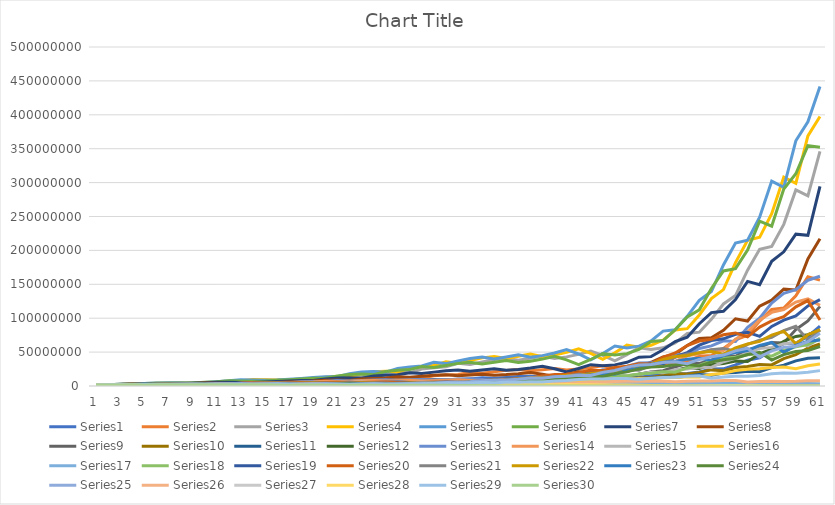
| Category | Series 0 | Series 1 | Series 2 | Series 3 | Series 4 | Series 5 | Series 6 | Series 7 | Series 8 | Series 9 | Series 10 | Series 11 | Series 12 | Series 13 | Series 14 | Series 15 | Series 16 | Series 17 | Series 18 | Series 19 | Series 20 | Series 21 | Series 22 | Series 23 | Series 24 | Series 25 | Series 26 | Series 27 | Series 28 | Series 29 |
|---|---|---|---|---|---|---|---|---|---|---|---|---|---|---|---|---|---|---|---|---|---|---|---|---|---|---|---|---|---|---|
| 0 | 1500000 | 1500000 | 1500000 | 1500000 | 1500000 | 1500000 | 1500000 | 1500000 | 1500000 | 1500000 | 1500000 | 1500000 | 1500000 | 1500000 | 1500000 | 1500000 | 1500000 | 1500000 | 1500000 | 1500000 | 1500000 | 1500000 | 1500000 | 1500000 | 1500000 | 1500000 | 1500000 | 1500000 | 1500000 | 1500000 |
| 1 | 1134576 | 1059408 | 1413792 | 1538352 | 1732752 | 1948752 | 1891152 | 1949904 | 1715184 | 1588464 | 1442304 | 1383696 | 1679328 | 1798272 | 1718928 | 1773072 | 1405296 | 1390032 | 1495440 | 1677600 | 1622736 | 1617408 | 1598256 | 1466928 | 1884384 | 1663776 | 1503792 | 1378080 | 1849968 | 1567584 |
| 2 | 794508.387 | 987287.105 | 1449584.234 | 1776388.918 | 2261662.356 | 2479684.665 | 2476535.729 | 2252513.849 | 1826694.554 | 1530477.456 | 1325306.334 | 1536051.606 | 2017744.064 | 2073802.851 | 2040958.206 | 1666823.842 | 1290280.17 | 1376446.944 | 1672966.006 | 1822139.791 | 1749967.989 | 1727049.266 | 1566522.589 | 1840861.535 | 2108086.916 | 1673867.708 | 1379790.25 | 1691233.685 | 1947899.026 | 1584606.081 |
| 3 | 731928.376 | 1000209.173 | 1673453.928 | 2317818.884 | 2888597.417 | 3272597.959 | 2877176.102 | 2420747.775 | 1769876.652 | 1409596.472 | 1463986.809 | 1830147.983 | 2331441.271 | 2476678.746 | 1926809.735 | 1537117.374 | 1263199.189 | 1529016.345 | 1817581.082 | 1973149.612 | 1868823.93 | 1696319.77 | 1970548.273 | 2057585.835 | 2138039.289 | 1541647.755 | 1690784.846 | 1773300.256 | 1983936.333 | 1812007.674 |
| 4 | 732278.317 | 1140017.458 | 2182991.184 | 2959507.087 | 3824133.077 | 3824616.197 | 3107428.082 | 2366091.785 | 1640429.284 | 1561699.374 | 1735647.634 | 2099082.258 | 2789324.759 | 2350966.008 | 1786447.627 | 1513033.61 | 1386356.218 | 1650159.668 | 1968742.399 | 2115736.072 | 1835791.76 | 2138591.033 | 2206859.983 | 2085103.514 | 1986028.237 | 1897475.205 | 1770546.885 | 1798545.884 | 2286351.073 | 1659281.783 |
| 5 | 823291.224 | 1469507.211 | 2786824.661 | 3917113.781 | 4479676.461 | 4151864.04 | 3051690.005 | 2214554.063 | 1831965.663 | 1857005.448 | 1981899.664 | 2494332.524 | 2652135.977 | 2194682.47 | 1770069.844 | 1670185.637 | 1478907.695 | 1775099.474 | 2111565.254 | 2086583.548 | 2314720.646 | 2399423.1 | 2240471.214 | 1935181.665 | 2468602.876 | 1994481.839 | 1793430.266 | 2063774.169 | 2108504.869 | 1786518.257 |
| 6 | 1047426.927 | 1858057.316 | 3687976.111 | 4587807.597 | 4872748.766 | 4097170.425 | 2871146.199 | 2503154.594 | 2195727.108 | 2126117.803 | 2345427.511 | 2356611.036 | 2480942.408 | 2192627.745 | 1967529.616 | 1791687.9 | 1571473.734 | 1890986.01 | 2083001.658 | 2641956.31 | 2597302.884 | 2440102.648 | 2083376.771 | 2403022.354 | 2616410.052 | 2027895.648 | 2055150.047 | 1895807.469 | 2288575.698 | 1909586.415 |
| 7 | 1310156.705 | 2439156.728 | 4318924.885 | 4989635.022 | 4817642.689 | 3875116.406 | 3265911.755 | 3035774.071 | 2531628.424 | 2522321.084 | 2207324.202 | 2187025.472 | 2484742.186 | 2458260.961 | 2124708.304 | 1915190.834 | 1653585.835 | 1853064.931 | 2638128.43 | 2974554.118 | 2641591.104 | 2273039.288 | 2592730.407 | 2544798.327 | 2682172.245 | 2332896.437 | 1885581.886 | 2048579.887 | 2465401.835 | 1945085.645 |
| 8 | 1704107.847 | 2839060.946 | 4696726.24 | 4932527.346 | 4565839.1 | 4435891.098 | 3984945.686 | 3536205.57 | 3022869.654 | 2379368.097 | 2038426.47 | 2169491.742 | 2792834.698 | 2676199.24 | 2287028.464 | 2027398.661 | 1600680.451 | 2330490.552 | 2970888.037 | 3034786.65 | 2460979.549 | 2834480.165 | 2750734.027 | 2606641.798 | 3111511.904 | 2148003.17 | 2034689.17 | 2197415.557 | 2530446.295 | 1754121.993 |
| 9 | 1969458.961 | 3071239.672 | 4642529.715 | 4674024.664 | 5239286.091 | 5445050.545 | 4665967.861 | 4261718.214 | 2868922.417 | 2203836.785 | 2009966.954 | 2414439.034 | 3047618.262 | 2904835.21 | 2437866.741 | 1974378.239 | 1986632.268 | 2609506.562 | 3031652.486 | 2836540.45 | 3069191.422 | 3012268.28 | 2822655.389 | 3021405.921 | 2886543.778 | 2327237.305 | 2179563.852 | 2245996.44 | 2300159.703 | 1822993.428 |
| 10 | 2117388.207 | 3020799.477 | 4398774.294 | 5362480.862 | 6445917.945 | 6407957.174 | 5649351.298 | 4079559.202 | 2677613.079 | 2180976.682 | 2222810.609 | 2610322.444 | 3315979.689 | 3121925.187 | 2390454.44 | 2466497.417 | 2200249.025 | 2648814.161 | 2834198.597 | 3550671.606 | 3262009.812 | 3096108.81 | 3277746.752 | 2800896.7 | 3154026.5 | 2502696.11 | 2224802.517 | 2032791.955 | 2412837.232 | 1889933.831 |
| 11 | 2070366.16 | 2846864.509 | 5046072.256 | 6596391.967 | 7600349.012 | 7793273.344 | 5430789.992 | 3848101.439 | 2674394.648 | 2421182.771 | 2388722.734 | 2813110.502 | 3572156.63 | 3085782.384 | 3008310.427 | 2746623.903 | 2210448.325 | 2462663.26 | 3548569.82 | 3785290.733 | 3353111.053 | 3601242.503 | 3043459.957 | 3057931.831 | 3419407.147 | 2564394.853 | 2010835.52 | 2121604.982 | 2525653.441 | 1672358.129 |
| 12 | 1938579.205 | 3244865.379 | 6206467.558 | 7776694.249 | 9258993.05 | 7522192.878 | 5149094.992 | 3892102.505 | 2997571.421 | 2611433.122 | 2558131.709 | 3002198.633 | 3538790.722 | 3916254.851 | 3370288.835 | 2773630.33 | 2032750.533 | 3064143.712 | 3783778.871 | 3902604.195 | 3900537.205 | 3348753.373 | 3328781.627 | 3312647.005 | 3531182.925 | 2326960.426 | 2095281.842 | 2209254.904 | 2257597.519 | 1694360.301 |
| 13 | 2192335.38 | 3966913.663 | 7316299.883 | 9472671.334 | 8950463.106 | 7166963.725 | 5239303.688 | 4418595.884 | 3262487.639 | 2807382.127 | 2713054.748 | 2947233.995 | 4501790.849 | 4417600.599 | 3422771.031 | 2564710.303 | 2497497.255 | 3250343.019 | 3901774.936 | 4553307.198 | 3627362.901 | 3668700.505 | 3612255.055 | 3418383.899 | 3230033.549 | 2435988.02 | 2178170.749 | 1964054.463 | 2316195.64 | 1754073.712 |
| 14 | 2660131.01 | 4652458.789 | 8911124.125 | 9156020.762 | 8543267.888 | 7333745.289 | 5983774.194 | 4866181.731 | 3540282.958 | 2988790.304 | 2646998.946 | 3713582.012 | 5087727.304 | 4514893.759 | 3183899.399 | 3171245.084 | 2621219.847 | 3334791.503 | 4553190.434 | 4245608.693 | 3974293.174 | 3987284.134 | 3733682.89 | 3124479.648 | 3412977.755 | 2544563.311 | 1932991.1 | 2001521.803 | 2430210.875 | 1851315.054 |
| 15 | 3099952.258 | 5641173.821 | 8612594.826 | 8738331.118 | 8760250.731 | 8422559.892 | 6625765.841 | 5344069.55 | 3803890.816 | 2927051.046 | 3313369.929 | 4164618.321 | 5208832.81 | 4227559.866 | 3963906.024 | 3346392.772 | 2661113.942 | 3871825.775 | 4246199.591 | 4665306.67 | 4319787.148 | 4127402.284 | 3418382.864 | 3298559.638 | 3599067.881 | 2269556.993 | 1965522.102 | 2085092.374 | 2600794.171 | 1551726.48 |
| 16 | 3737379.098 | 5430079.906 | 8218953.227 | 8958929.321 | 10081343.223 | 9372822.188 | 7315902.692 | 5808457.832 | 3758924.305 | 3678764.072 | 3695764.337 | 4233440.06 | 4886096.458 | 5302626.676 | 4206877.228 | 3415673.164 | 3056598.805 | 3594556.548 | 4666806.339 | 5084845.534 | 4471957.674 | 3784516.008 | 3615785.338 | 3475338.158 | 3241705.496 | 2322237.66 | 2042749.382 | 2215113.592 | 2211727.828 | 1193107.675 |
| 17 | 3578878.388 | 5156635.683 | 8425569.64 | 10308477.208 | 11239078.36 | 10400094.21 | 7992415.3 | 5803330.997 | 4769325.417 | 4116988.04 | 3737898.121 | 3941858.945 | 6140976.81 | 5662436.816 | 4318286.092 | 3945031.072 | 2810383.176 | 3930909.884 | 5087348.858 | 5277736.531 | 4100789.101 | 4009936.466 | 3816969.789 | 3127428.581 | 3356862.245 | 2429657.235 | 2164804.653 | 1869451.932 | 1735246.886 | 1354867.961 |
| 18 | 3377264.999 | 5256665.143 | 9693794.556 | 11490805.162 | 12493019.19 | 11414243.383 | 8023890.375 | 7447669.677 | 5378758.887 | 4176907.821 | 3462021.078 | 4913039.427 | 6568498.29 | 5847361.497 | 5016173.049 | 3645408.427 | 3040007.836 | 4265009.642 | 5281188.614 | 4852485.976 | 4345462.422 | 4240364.879 | 3441691.951 | 3234984.209 | 3556432.447 | 2592671.37 | 1822300.582 | 1451354.689 | 2032116.368 | 1526866.757 |
| 19 | 3417586.932 | 6014587.878 | 10804652.276 | 12771210.708 | 13733892.108 | 11508488.846 | 10348032.564 | 8475988.87 | 5496168.364 | 3881325.458 | 4288863.139 | 5219033.436 | 6793829.959 | 6833328.537 | 4658997.139 | 3965636.526 | 3264148.336 | 4407738.677 | 4856451.291 | 5157521.744 | 4595611.698 | 3830193.618 | 3568604.756 | 3423424.919 | 3843569.695 | 2198232.901 | 1409668.076 | 1672917.498 | 2360859.969 | 1340702.813 |
| 20 | 3881835.932 | 6670842.24 | 12007547.147 | 14038060.268 | 13868471.891 | 14906408.897 | 11822259.847 | 8733056.64 | 5145366.643 | 4826401.748 | 4532940.073 | 5362117.794 | 7951983.158 | 6380604.075 | 5097445.95 | 4281248.422 | 3339582.573 | 4034919.278 | 5162693.111 | 5470889.553 | 4151481.879 | 3979842.683 | 3785864.481 | 3695621.742 | 3301394.998 | 1717582.083 | 1615926.156 | 1913768.794 | 2136961.505 | 1270613.973 |
| 21 | 4277001.175 | 7377662.015 | 13197568.464 | 14174074.659 | 17990761.425 | 17087626.216 | 12223155.191 | 8245389.886 | 6452396.248 | 5117127.373 | 4634069.399 | 6234406.484 | 7435488.211 | 7022354.748 | 5533252.033 | 4403355.755 | 3025645.546 | 4267200.163 | 5477388.027 | 4957310.849 | 4314188.299 | 4231349.423 | 4097044.393 | 3170676.933 | 2625407.462 | 1999105.21 | 1838453.943 | 1706164.482 | 2107804.376 | 1273046.209 |
| 22 | 4699174.187 | 8072210.366 | 13324433.938 | 18385192.455 | 20647834.584 | 17720509.457 | 11581235.708 | 10438197.133 | 6888965.978 | 5247501.314 | 5360833.962 | 5795200.436 | 8195888.405 | 7665093.806 | 5720949.156 | 4011204.347 | 3161616.494 | 4503858.576 | 4964127.468 | 5170472.842 | 4587375.217 | 4589097.455 | 3523895.16 | 2517583.486 | 3135942.707 | 2308780.512 | 1630012.261 | 1650190.523 | 2221877.983 | 1352576.609 |
| 23 | 5109740.933 | 8115585.98 | 17281816.346 | 21098734.602 | 21435266.909 | 16841003.069 | 14717995.866 | 11230648.648 | 7112689.684 | 6089538.751 | 4960811.66 | 6346325.849 | 8958841.165 | 7966908.234 | 5239406.246 | 4218195.005 | 3296307.615 | 4060336.944 | 5178736.112 | 5518505.212 | 4975818.372 | 3955721.879 | 2807434.049 | 3000499.967 | 3711622.677 | 2077787.717 | 1565083.611 | 1697627.531 | 2513553.148 | 1199221.245 |
| 24 | 5107327.088 | 10481437.429 | 19831345.846 | 21901713.702 | 20393025.638 | 21473563.197 | 15884705.391 | 11681522.895 | 8310549.274 | 5650959.005 | 5405332.795 | 6894805.871 | 9324160.704 | 7335214.988 | 5543882.256 | 4426680.629 | 2934261.638 | 4209175.53 | 5528580.581 | 6008024.045 | 4289581.463 | 3160608.36 | 3362102.545 | 3544052.107 | 3419548.155 | 2034368.047 | 1595116.129 | 1865195.028 | 2391919.726 | 1246239.152 |
| 25 | 6557211.425 | 11988204.58 | 20585017.781 | 20835221.701 | 26032708.974 | 23237398.754 | 16571359.925 | 13749160.607 | 7758753.285 | 6176690.166 | 5844547.739 | 7134511.956 | 8596480.4 | 7808694.536 | 5854383.539 | 3967315.906 | 2995055.851 | 4464462.541 | 6020341.885 | 5198618.218 | 3427904.683 | 3800736.073 | 3988840.841 | 3258913.983 | 3447940.192 | 2125167.912 | 1732327.02 | 1719450.282 | 2729244.769 | 1286648.622 |
| 26 | 7465055.368 | 12407287.305 | 19581619.609 | 26595015.14 | 28196943.373 | 24302798.379 | 19561072.363 | 12918665.192 | 8537657.233 | 6698538.569 | 6020194.179 | 6539404.909 | 9165413.054 | 8296246.817 | 5280665.837 | 4083461.012 | 3125479.342 | 4830370.621 | 5210436.356 | 4174671.862 | 4123098.359 | 4526323.088 | 3683160.825 | 3278282.299 | 3730653.517 | 2378664.138 | 1576051.585 | 1884864.143 | 3116638.305 | 1187615.702 |
| 27 | 7693766.105 | 11767712.132 | 24993443.202 | 28804119.971 | 29515280.141 | 28757576.429 | 18425642.482 | 14315590.013 | 9317600.245 | 6919619.005 | 5492424.466 | 6926003.548 | 9752514.674 | 7529443.467 | 5477732.875 | 4299046.527 | 3326284.342 | 4153726.184 | 4185386.838 | 5056079.136 | 4911235 | 4194116.186 | 3723842.276 | 3537450.666 | 4347300.701 | 2237983.045 | 1697683.04 | 2066253.532 | 3211021.948 | 1241868.665 |
| 28 | 7266345.929 | 14971714.041 | 27068292.711 | 30148995.939 | 34954897.131 | 27145406.122 | 20473671.614 | 15725407.3 | 9683022.238 | 6331463.806 | 5786068.118 | 7320907.699 | 8864688.997 | 7868125.846 | 5813786.652 | 4616732.355 | 2812433.984 | 3308246.659 | 5071139.873 | 6060261.034 | 4551640.028 | 4258441.57 | 4041832.091 | 4109769.861 | 4264295.718 | 2518072.868 | 1826169.917 | 2041720.673 | 3839676.569 | 1203251.538 |
| 29 | 9201873.534 | 16173015.922 | 28330918.925 | 35703281.581 | 33019123.881 | 30231300.28 | 22546296.824 | 16442282.444 | 8913907.39 | 6692461.949 | 6082978.822 | 6609910.731 | 9280278.807 | 8413985.016 | 6294423.041 | 3940020.877 | 2189077.673 | 3960207.75 | 6080557.016 | 5648771.003 | 4622503.698 | 4644571.664 | 4726192.727 | 4019225.56 | 5042597.635 | 2835782.711 | 1767740.632 | 2328928.67 | 4276356.347 | 991476.788 |
| 30 | 9903149.865 | 16886449.066 | 33548881.762 | 33724342.194 | 36801339.936 | 33361092.644 | 23629064.659 | 15228997.731 | 9487657.935 | 7059912.499 | 5461863.375 | 6864619.857 | 9942414.12 | 9177791.891 | 5416272.257 | 3106172.659 | 2533179.206 | 4696639.17 | 5669595.497 | 5776143.522 | 5042957.21 | 5459827.608 | 4651813.163 | 4736526.568 | 5956108.355 | 2881510.957 | 1966914.819 | 2480266.995 | 4132230.74 | 868576.425 |
| 31 | 10303391.716 | 19949508.599 | 31688234.911 | 37585273.731 | 40640144.459 | 35030701.607 | 21936022.169 | 16321174.857 | 10078315.117 | 6361261.911 | 5634485.95 | 7294555.343 | 10864591.202 | 7956352.872 | 4317608.61 | 3663643.912 | 2909107.809 | 4335171.781 | 5799756.288 | 6350570.801 | 5929816.168 | 5401904.136 | 5522215.78 | 5577040.082 | 6336431.279 | 3393789.928 | 2042380.451 | 2288596.174 | 4512449.368 | 745910.785 |
| 32 | 12130177.043 | 18804946.544 | 35314718.939 | 41503771.923 | 42702026.111 | 32582657.094 | 23569884.578 | 17455604.003 | 9145221.243 | 6590173.83 | 5945995.018 | 7907110.567 | 9435502.993 | 6405068.035 | 5175011.039 | 4285355.677 | 2603522.125 | 4381156.792 | 6379396.178 | 7529956.299 | 5868524.21 | 6450263.127 | 6545664.82 | 5916002.636 | 7835264.427 | 3727432.111 | 1832431.495 | 2364013.965 | 5173724.351 | 463571.273 |
| 33 | 11399983.148 | 20911272.282 | 38995144.062 | 43607452.642 | 39743524.035 | 35083673.505 | 25271852.71 | 15947787.681 | 9554625.066 | 6985190.282 | 6400668.263 | 6812185.038 | 7613570.479 | 7784331.444 | 6144454.838 | 3904388.661 | 2530813.885 | 4752905.206 | 7567761.176 | 7512537.443 | 7009602.374 | 7686113.361 | 6986166.549 | 7293925.628 | 8986950.251 | 3551990.337 | 1824561.345 | 2552673.327 | 4764321.558 | 226582.903 |
| 34 | 12635715.63 | 23044501.368 | 40970358.223 | 40584373.457 | 42824840.497 | 37694705.981 | 23146768.925 | 16796122.478 | 10215359.182 | 7552641.788 | 5475794.099 | 5439090.372 | 9283194.329 | 9359392.933 | 5677664.734 | 3882983.575 | 2620159.05 | 5554623.269 | 7553727.068 | 9053969.551 | 8354928.679 | 8242719.555 | 8666878.2 | 8345102.24 | 8932152.94 | 3816519.059 | 1885940.366 | 2209716.507 | 5540957.366 | 0 |
| 35 | 13883162.722 | 24167053.101 | 38128892.908 | 43728675.155 | 46044010.285 | 34595402.729 | 24449417.809 | 18103708.1 | 11140411.135 | 6490283.584 | 4331185.089 | 6534149.953 | 11193863.186 | 8748552.843 | 5745388.229 | 4133940.146 | 2901237.516 | 5464253.391 | 9108210.945 | 10877823.851 | 8962205.313 | 10274804.316 | 9968304.09 | 8274862.264 | 10064285.346 | 4303086.69 | 1552655.679 | 2372632.713 | 5665485.171 | 0 |
| 36 | 14519044.906 | 22450020.518 | 41081518.64 | 47013483.332 | 42287183.081 | 36628919.214 | 26429763.639 | 19899696.877 | 9655816.964 | 5164556.332 | 5133230.52 | 7774474.601 | 10490680.878 | 8975811.687 | 6242265.99 | 4730507.42 | 2697736.709 | 6482706.546 | 10947860.222 | 11751939.411 | 11174441.345 | 11865403.905 | 9932947.186 | 9300149.859 | 11901314.072 | 3897605.62 | 1548158.204 | 2237319.063 | 6090505.396 | 0 |
| 37 | 13450427.639 | 24139597.706 | 44165978.308 | 43175472.301 | 44808363.197 | 39688835.757 | 29133572.132 | 17382259.227 | 7771117.403 | 6174370.008 | 6031665.922 | 7197808.552 | 10796403.991 | 9905488.098 | 7307233.331 | 4555674.933 | 2990529.193 | 7679905.867 | 11832282.403 | 14756346.603 | 12906996.614 | 11867314.671 | 11222840.456 | 10971076.574 | 11283117.685 | 4442020.171 | 1336655.168 | 2189546.066 | 5753994.111 | 0 |
| 38 | 14418352.451 | 25900957.8 | 40559071.514 | 45747059.126 | 48589694.073 | 43847743.426 | 25517682.414 | 14131163.951 | 9441044.159 | 7313853.672 | 5519253.757 | 7300784.612 | 11955537.134 | 11791971.012 | 7200031.236 | 5273271.73 | 3317025.795 | 8192588.337 | 14862993.008 | 17144461.834 | 12911541.829 | 13461761.792 | 13306310.793 | 10378136.394 | 13575259.943 | 4454902.559 | 1155408.495 | 1863780.025 | 7227087.092 | 0 |
| 39 | 15423988.938 | 23739521.35 | 42973159.629 | 49604869.141 | 53721626.301 | 38489418.854 | 20817871.508 | 17408367.011 | 11347562.989 | 6743496.962 | 5518608.589 | 7953548.588 | 14284017.739 | 11809602.524 | 8557703.613 | 6105739.457 | 3318407.111 | 10158362.627 | 17273905.344 | 17242477.482 | 14649267.74 | 16021074.422 | 12645427.564 | 12455078.986 | 14313356.206 | 4689722.808 | 824182.731 | 2044721.437 | 8018244.924 | 0 |
| 40 | 14094813.856 | 25095875.067 | 46595267.375 | 54841129.381 | 47190852.395 | 31487907.336 | 25768316.684 | 21182113.767 | 10603782.453 | 6805865.754 | 5912888.325 | 9337849.122 | 14354557.753 | 14292214.108 | 10154979.279 | 6375546.53 | 3840110.596 | 11678718.551 | 17377714.794 | 19674202.73 | 17437694.834 | 15277365.311 | 15255503.96 | 13103291.281 | 15882065.875 | 4336213.872 | 648432.849 | 1986513.274 | 9469623.111 | 0 |
| 41 | 14848463.499 | 27150455.21 | 51511952.445 | 48171811.754 | 38642049.413 | 39122058.782 | 31484036.289 | 20012583.676 | 10875374.421 | 7371902.496 | 6815349.757 | 9227410.108 | 17437084.641 | 17234242.279 | 10849334.815 | 7733425.043 | 4147720.357 | 11632655.641 | 19834585.2 | 23543937.989 | 16631107.934 | 18501220.74 | 16123019.597 | 14507259.276 | 15474637.725 | 5309806.568 | 351158.79 | 2025496.25 | 10231872.365 | 0 |
| 42 | 16008609.477 | 29951184.105 | 45245906.519 | 39442756.905 | 48070095.372 | 47954077.199 | 29854274.348 | 20790655.806 | 11997047.418 | 8600698.467 | 6612254.186 | 11002997.693 | 21094890.601 | 18679658.288 | 13473101.414 | 8723587.331 | 3885007.134 | 13137646.899 | 23742650.072 | 22562330.508 | 20144528.683 | 19618320.93 | 17932255.011 | 14105541.507 | 20116267.399 | 5761074.301 | 0 | 1879618.8 | 10321495.021 | 0 |
| 43 | 17601204.814 | 26253514.173 | 37045386.429 | 49061912.511 | 58984540.346 | 45600339.161 | 31145245.916 | 23261972.528 | 14275870.629 | 8446496.71 | 7720765.801 | 13094907.258 | 22929599.14 | 23529697.034 | 15509523.405 | 8534920.194 | 4088751.038 | 15570245.012 | 22758564.722 | 27473929.944 | 21364429.142 | 21891674.093 | 17511056.571 | 18295055.55 | 22965841.895 | 6656112.056 | 0 | 1591038.351 | 10999671.087 | 0 |
| 44 | 15378332.656 | 21438725.039 | 46077112.066 | 60197095.336 | 56141200.196 | 47725932.957 | 35005766.591 | 28093137.644 | 14291500.008 | 10001613.509 | 9013396.71 | 14027476.189 | 28963536.66 | 27409286.892 | 15466763.144 | 9451984.672 | 4508491.305 | 14791435.123 | 27720692.43 | 29270955.184 | 23844062.87 | 21443476.921 | 22817960.967 | 20848507.949 | 27858785.317 | 7049501.045 | 0 | 1350459.659 | 11076988.876 | 0 |
| 45 | 12506008.291 | 26571216.572 | 56531956.194 | 57291605.243 | 58819900.231 | 53827798.465 | 42472979.641 | 28517545.971 | 17288310.806 | 11828050.024 | 9485271.134 | 17466165.319 | 33816098.263 | 27631352.634 | 17490135.52 | 10990902.403 | 3991407.65 | 17837020.067 | 29540990.062 | 32815115.129 | 23359501.678 | 28034500.961 | 26100337.967 | 25248218.538 | 30810360.104 | 6970645.2 | 0 | 1013007.291 | 9964499.311 | 0 |
| 46 | 15412981.526 | 32501290.975 | 53800959.411 | 60020789.92 | 66414692.607 | 65540514.768 | 43299861.231 | 35017228.42 | 20839129.481 | 12597550.886 | 11599248.171 | 20151140.009 | 34160190.67 | 31606774.037 | 20753863.172 | 10258572.54 | 4417661.14 | 18844480.004 | 33125669.694 | 32282605.762 | 30544482.5 | 32152048.494 | 31716430.231 | 27883688.128 | 31780446.8 | 7269578.184 | 0 | 585430.138 | 11570298.165 | 0 |
| 47 | 18761230.825 | 30849095.221 | 56360991.48 | 67765329.156 | 80958255.869 | 67032176.254 | 53409921.034 | 42757379.434 | 22579270.138 | 15595203.666 | 13177656.699 | 20137041.757 | 39158994.221 | 37911279.232 | 19737564.882 | 12123128.295 | 4302398.746 | 20951521.518 | 32595246.244 | 42399593.281 | 35035286.257 | 39163764.301 | 35128624.625 | 28723498.596 | 34660789.133 | 7160760.042 | 0 | 232467.927 | 12426123.072 | 0 |
| 48 | 17731272.071 | 32219216.689 | 63629843.388 | 82598108.926 | 82886590.034 | 82963151.48 | 65466100.249 | 46852701.93 | 28432466.988 | 17904871.458 | 12980336.493 | 22821622.746 | 47063585.462 | 36405767.564 | 23831132.719 | 12579445.956 | 4379932.108 | 20452445.989 | 42820109.082 | 48804809.551 | 42680841.372 | 43464698.098 | 36284755.259 | 31284595.701 | 35700817.516 | 6291398.971 | 0 | 0 | 12839857.833 | 0 |
| 49 | 18427735.937 | 36256607.168 | 77553163.814 | 84559404.381 | 102696410.154 | 101979530.349 | 71973381.798 | 59643045.957 | 33111474.906 | 17811752.809 | 14483348.413 | 27136858.421 | 45274616.463 | 44431963.095 | 25204411.366 | 13733303.53 | 3905015.863 | 26641029.48 | 49297864.324 | 59643674.071 | 47372748.004 | 44979490.997 | 39628745.399 | 32181878.084 | 32863240.716 | 7099094.65 | 0 | 0 | 14280106.536 | 0 |
| 50 | 20626797.532 | 44044819.657 | 79390693.567 | 104761152.203 | 126350182.431 | 112388612.884 | 91909166.985 | 70076005.394 | 33371589.403 | 20088877.352 | 16966092.562 | 25856879.079 | 55363447.353 | 47430432.114 | 28052729.204 | 13174120.29 | 4567854.911 | 30464418.608 | 60256103.525 | 66376356.958 | 49028288.236 | 49217941.251 | 40872272.86 | 29585943.035 | 39185983.975 | 7421516.516 | 0 | 0 | 15004024.287 | 0 |
| 51 | 24921396.193 | 44952998.802 | 98352475.118 | 128882385.941 | 139354090.481 | 143848688.788 | 108258921.788 | 71188945.339 | 38163110.11 | 23777773.505 | 15945439.825 | 31285846.958 | 59197444.644 | 53274552.043 | 27412196.164 | 16835568.216 | 4747118.671 | 37009689.106 | 67067113.216 | 68865251.572 | 53653274.755 | 50853753.255 | 37673637.162 | 35227101.635 | 43093825.756 | 7460189.302 | 0 | 0 | 11310310.438 | 0 |
| 52 | 25307966.413 | 55514782.803 | 120992830.85 | 142139301.418 | 178491987.374 | 169749519.583 | 110224369.027 | 82084697.523 | 45764500.995 | 22561801.889 | 18995247.128 | 33149726.221 | 66598530.221 | 52502196.858 | 35745459.748 | 18953485.289 | 5241764.28 | 40982126.893 | 69590724.073 | 75548139.604 | 55441410.17 | 46957769.449 | 44988928.879 | 38691275.385 | 45566655.827 | 8057607.227 | 0 | 0 | 13276127.932 | 0 |
| 53 | 31089249.114 | 68114058.104 | 133433265.51 | 182050252.911 | 210752701.644 | 173111762.073 | 127387386.148 | 99186166.603 | 43937829.454 | 27171192.798 | 19852911.567 | 36963362.347 | 65730365.473 | 69083779.923 | 40911068.958 | 22696725.565 | 5312348.296 | 42322013.944 | 76353711.071 | 78248679.292 | 51198453.526 | 56188076.835 | 49539657.542 | 40862400.186 | 51870062.552 | 8226228.423 | 0 | 0 | 14225574.284 | 0 |
| 54 | 37974796.915 | 74948568.228 | 170893688.717 | 214945444.601 | 215036846.629 | 200399805.737 | 154250806.171 | 95869310.405 | 53612102.365 | 28672545.916 | 21834632.873 | 36181228.503 | 86624748.179 | 79636688.038 | 49740056.674 | 24824778.183 | 5011938.443 | 46212572.688 | 79092516.497 | 72427490.984 | 61268346.708 | 61978934.284 | 52446825.897 | 46459967.383 | 55694048.62 | 6016899.837 | 0 | 0 | 14287577.364 | 0 |
| 55 | 41624930.664 | 95785948.637 | 201767333.843 | 219307055.97 | 249063697.187 | 243027175.943 | 149366896.254 | 117839918.439 | 57218719.372 | 31841631.631 | 21095881.946 | 47266766.305 | 99979827.099 | 97450593.146 | 55115683.636 | 25339545.856 | 4948729.418 | 47653061.092 | 73217199.375 | 86896400.561 | 67588521.198 | 65723715.895 | 59774341.859 | 49831188.696 | 42900443.281 | 6765168.769 | 0 | 0 | 15546168.669 | 0 |
| 56 | 53003797.262 | 112898569.148 | 205856478.976 | 254000418.688 | 302185644.472 | 235642978.598 | 183963509.064 | 126552877.039 | 64256451.603 | 31049304.088 | 27173100.136 | 54176665.556 | 122478511.466 | 108569912.052 | 56953092.061 | 27340869.111 | 4588917.444 | 43914929.664 | 87855406.46 | 96073548.409 | 71677976.619 | 75026843.945 | 64251872.763 | 38343837.258 | 51838499.87 | 6963181.265 | 0 | 0 | 18022976.729 | 0 |
| 57 | 62290233.922 | 115014161.905 | 238416029.696 | 308165183.763 | 293124922.005 | 290636363.82 | 197896529.753 | 142978746.34 | 63313569.785 | 40396951.248 | 30791843.9 | 65955909.63 | 136578397.808 | 112754941.518 | 62227808.444 | 27871214.161 | 3757449.476 | 52430288.487 | 97144811.157 | 102100039.517 | 81830349.926 | 80764862.706 | 49545648.544 | 46268503.394 | 56969049.026 | 6707791.867 | 0 | 0 | 19252295.261 | 0 |
| 58 | 63292909.998 | 133001228.207 | 289250878.696 | 298916627.92 | 361693992.728 | 313021778.166 | 223942572.355 | 141662860.435 | 83293981.186 | 46151024.181 | 37097559.163 | 73165878.015 | 141962611.838 | 123822436.003 | 64205926.961 | 25389629.75 | 3854227.95 | 57722411.461 | 103249464.741 | 116800325.981 | 88094969.817 | 62367624.709 | 59952321.02 | 50788011.925 | 58640347.749 | 6971792.964 | 0 | 0 | 18770763.672 | 0 |
| 59 | 72996069.353 | 161134779.549 | 280564404.138 | 368829168.69 | 389697375.414 | 354625430.334 | 222207038.232 | 187453346.47 | 96003311.685 | 56018585.494 | 40789131.344 | 75683817.008 | 156028364.612 | 128371069.123 | 59204548.839 | 29917202.68 | 3639199.724 | 61098424.446 | 118127488.967 | 125975365.231 | 68032724.96 | 75607271.956 | 65964413.93 | 52219715.535 | 65433888.909 | 7717783.157 | 0 | 0 | 20283480.172 | 0 |
| 60 | 88221627.04 | 156105903.089 | 346177209.376 | 397374747.537 | 441649266.598 | 352242962.676 | 294481185.921 | 217041813.305 | 117462661.145 | 61986408.093 | 41842999.916 | 82780297.101 | 161888250.297 | 118932946.288 | 70731873.704 | 32558691.351 | 3246062.65 | 69621960.653 | 127418707.899 | 97461266.798 | 82482394.908 | 83319555.804 | 67976135.788 | 58204385.123 | 77675272.037 | 7893073.03 | 0 | 0 | 22684556.839 | 0 |